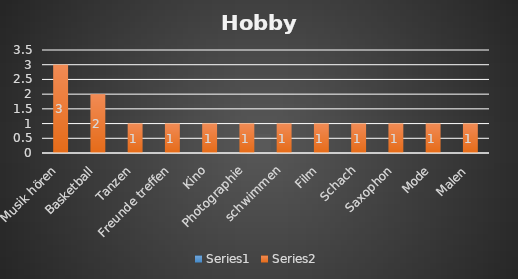
| Category | Series 0 | Series 1 |
|---|---|---|
| Musik hören |  | 3 |
| Basketball |  | 2 |
| Tanzen |  | 1 |
| Freunde treffen |  | 1 |
| Kino |  | 1 |
| Photographie |  | 1 |
| schwimmen |  | 1 |
| Film |  | 1 |
| Schach |  | 1 |
| Saxophon |  | 1 |
| Mode |  | 1 |
| Malen |  | 1 |